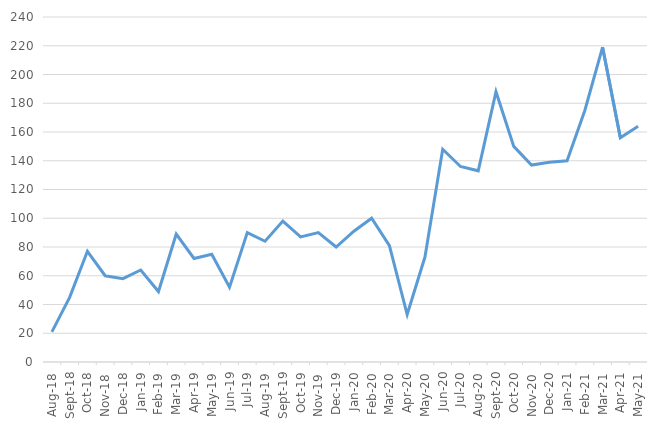
| Category | Series 0 |
|---|---|
| 2018-08-01 | 21 |
| 2018-09-01 | 45 |
| 2018-10-01 | 77 |
| 2018-11-01 | 60 |
| 2018-12-01 | 58 |
| 2019-01-01 | 64 |
| 2019-02-01 | 49 |
| 2019-03-01 | 89 |
| 2019-04-01 | 72 |
| 2019-05-01 | 75 |
| 2019-06-01 | 52 |
| 2019-07-01 | 90 |
| 2019-08-01 | 84 |
| 2019-09-01 | 98 |
| 2019-10-01 | 87 |
| 2019-11-01 | 90 |
| 2019-12-01 | 80 |
| 2020-01-01 | 91 |
| 2020-02-01 | 100 |
| 2020-03-01 | 81 |
| 2020-04-01 | 33 |
| 2020-05-01 | 73 |
| 2020-06-01 | 148 |
| 2020-07-01 | 136 |
| 2020-08-01 | 133 |
| 2020-09-01 | 188 |
| 2020-10-01 | 150 |
| 2020-11-01 | 137 |
| 2020-12-01 | 139 |
| 2021-01-01 | 140 |
| 2021-02-01 | 175 |
| 2021-03-01 | 219 |
| 2021-04-01 | 156 |
| 2021-05-01 | 164 |